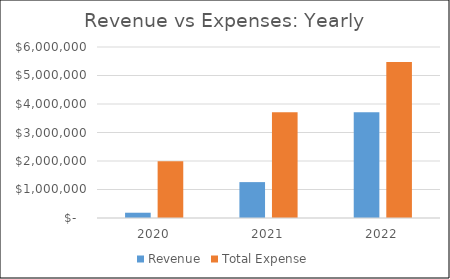
| Category | Revenue | Total Expense |
|---|---|---|
| 2020.0 | 185116.622 | 1991488.034 |
| 2021.0 | 1259239.799 | 3713267.155 |
| 2022.0 | 3713584.776 | 5474686.779 |